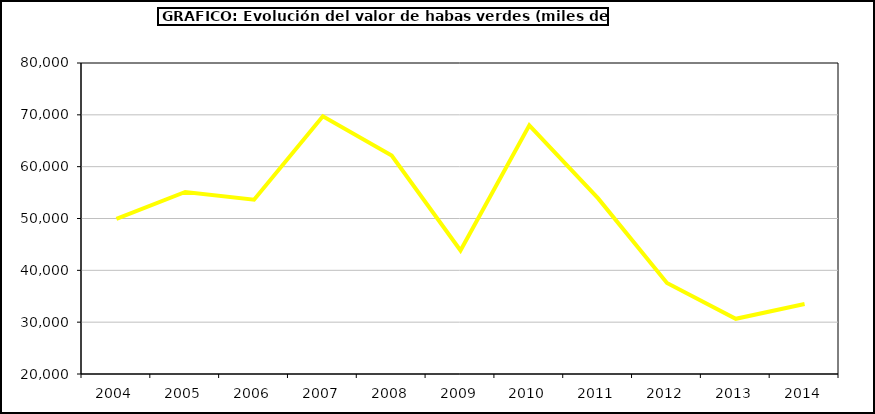
| Category | Valor |
|---|---|
| 2004.0 | 49917.223 |
| 2005.0 | 55120.332 |
| 2006.0 | 53633.866 |
| 2007.0 | 69730.927 |
| 2008.0 | 62129.509 |
| 2009.0 | 43829.181 |
| 2010.0 | 67988.319 |
| 2011.0 | 53880.612 |
| 2012.0 | 37566.616 |
| 2013.0 | 30653.095 |
| 2014.0 | 33509.136 |